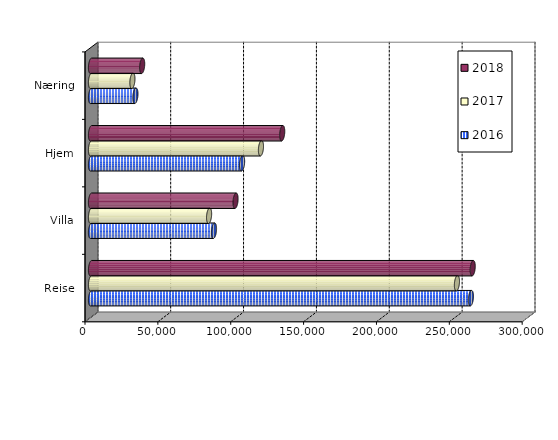
| Category | 2016 | 2017 | 2018 |
|---|---|---|---|
| Reise | 260701 | 251107 | 261928 |
| Villa | 84406.459 | 81032.696 | 99193.467 |
| Hjem | 103685.176 | 116619.932 | 131214.516 |
| Næring | 30478.767 | 28412.883 | 35114.516 |